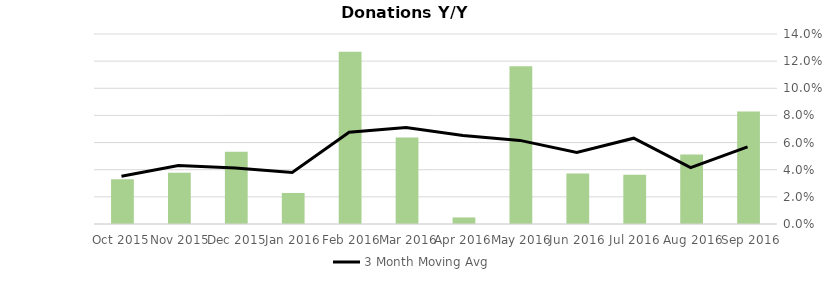
| Category | Arts, Culture & Humanities Donations |
|---|---|
| Sep 2016 | 0.083 |
| Aug 2016 | 0.051 |
| Jul 2016 | 0.036 |
| Jun 2016 | 0.037 |
| May 2016 | 0.116 |
| Apr 2016 | 0.005 |
| Mar 2016 | 0.064 |
| Feb 2016 | 0.127 |
| Jan 2016 | 0.023 |
| Dec 2015 | 0.053 |
| Nov 2015 | 0.038 |
| Oct 2015 | 0.033 |